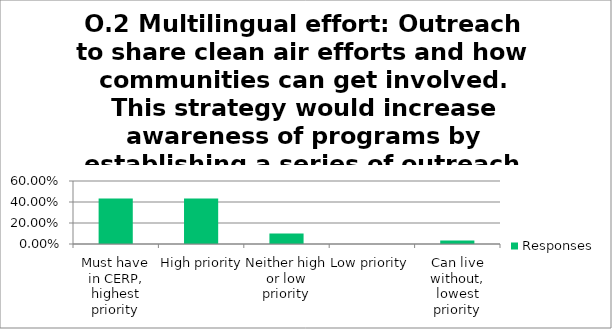
| Category | Responses |
|---|---|
| Must have in CERP, highest priority | 0.433 |
| High priority | 0.433 |
| Neither high or low priority | 0.1 |
| Low priority | 0 |
| Can live without, lowest priority | 0.033 |